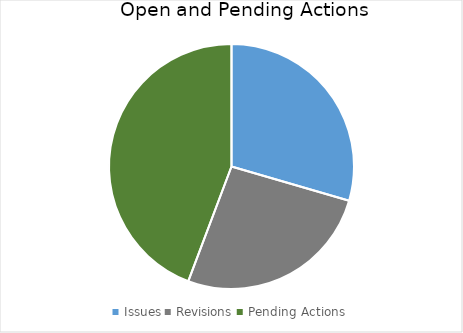
| Category | Series 0 |
|---|---|
| Issues | 18 |
| Revisions | 16 |
| Pending Actions | 27 |